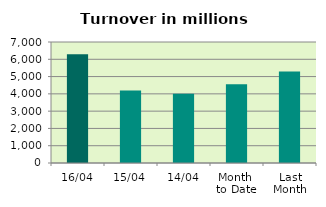
| Category | Series 0 |
|---|---|
| 16/04 | 6295.229 |
| 15/04 | 4189.156 |
| 14/04 | 4004.699 |
| Month 
to Date | 4562.498 |
| Last
Month | 5289.077 |